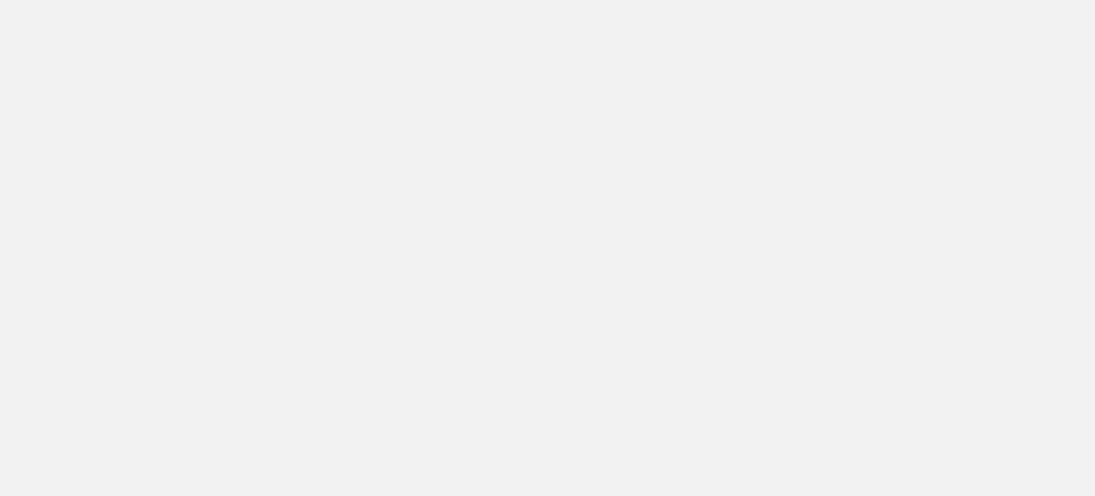
| Category | Total |
|---|---|
| Al Hodeidah | 75500 |
| Hajjah | 58854 |
| Marib | 55150 |
| Taiz | 17043 |
| Al Jawf | 12808 |
| Sadah | 7223 |
| Abyan | 6817 |
| Amran | 4910 |
| Sanaa | 4299 |
| Lahj | 4285 |
| Aden | 3661 |
| Hadramawt | 3250 |
| Ad Dali | 2994 |
| Ibb | 2727 |
| Dhamar | 2228 |
| Al Bayda | 1995 |
| Shabwah | 1249 |
| Al Mahwit | 680 |
| Sanaa City | 661 |
| Al Maharah | 353 |
| Raymah | 197 |
| Socotra | 15 |